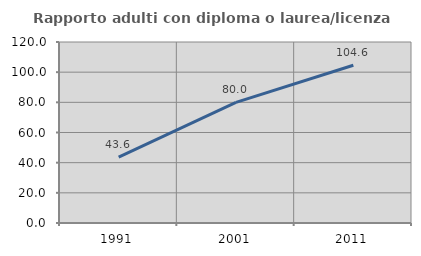
| Category | Rapporto adulti con diploma o laurea/licenza media  |
|---|---|
| 1991.0 | 43.605 |
| 2001.0 | 80 |
| 2011.0 | 104.564 |